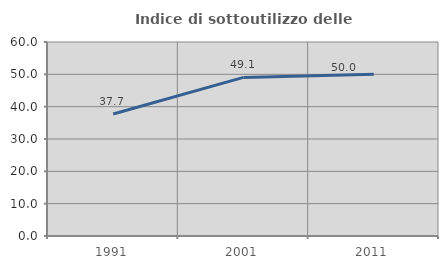
| Category | Indice di sottoutilizzo delle abitazioni  |
|---|---|
| 1991.0 | 37.719 |
| 2001.0 | 49.051 |
| 2011.0 | 50 |